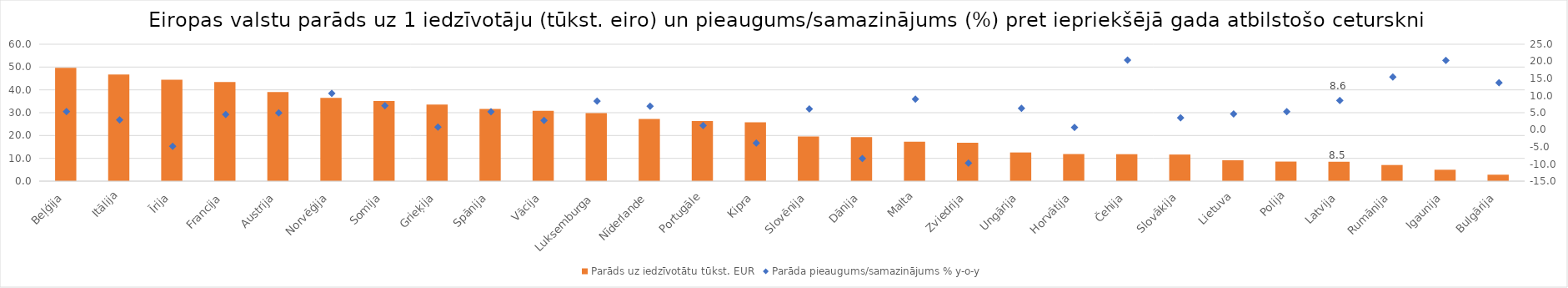
| Category | Parāds uz iedzīvotātu tūkst. EUR |
|---|---|
|  Beļģija | 49.663 |
| Itālija | 46.742 |
| Īrija | 44.418 |
| Francija | 43.484 |
| Austrija | 39.066 |
| Norvēģija | 36.522 |
| Somija | 35.103 |
| Grieķija | 33.597 |
| Spānija | 31.677 |
| Vācija | 30.793 |
| Luksemburga | 29.784 |
| Nīderlande | 27.291 |
| Portugāle | 26.332 |
| Kipra | 25.833 |
| Slovēnija | 19.573 |
| Dānija | 19.27 |
| Malta | 17.282 |
| Zviedrija | 16.817 |
| Ungārija | 12.574 |
| Horvātija | 11.876 |
| Čehija | 11.817 |
| Slovākija | 11.662 |
| Lietuva | 9.149 |
| Polija | 8.58 |
| Latvija | 8.502 |
| Rumānija | 7.074 |
| Igaunija | 4.998 |
| Bulgārija | 2.83 |